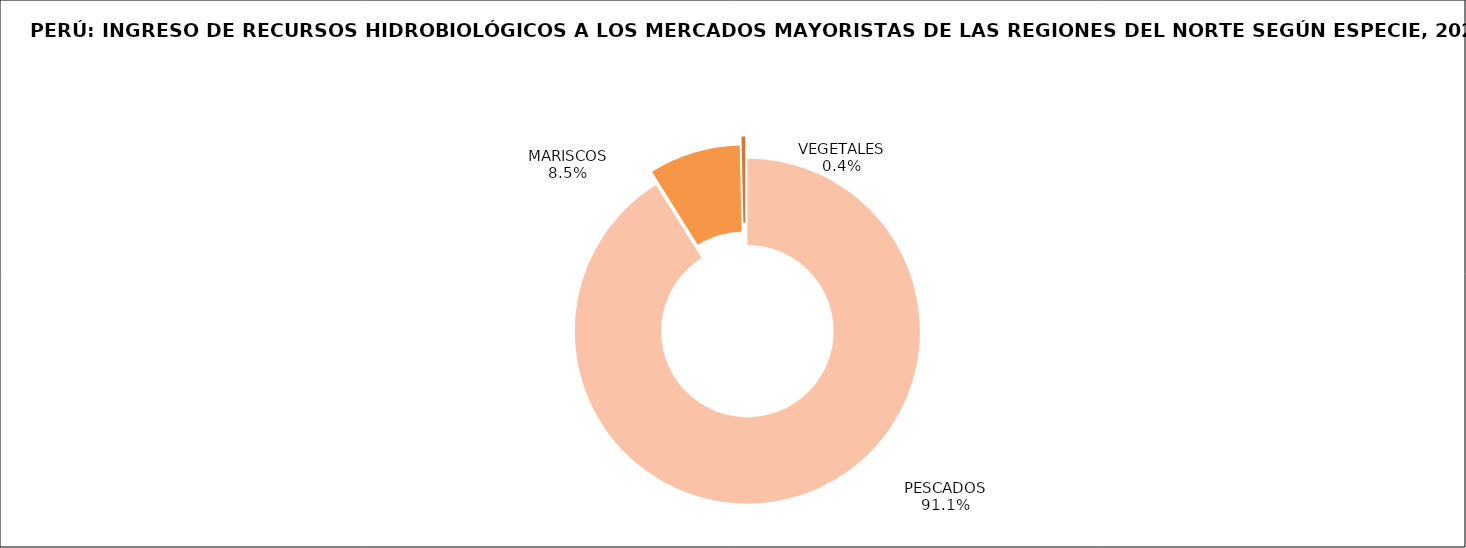
| Category | Series 0 |
|---|---|
| PESCADOS | 79016.087 |
| MARISCOS | 7413.514 |
| VEGETALES | 307.212 |